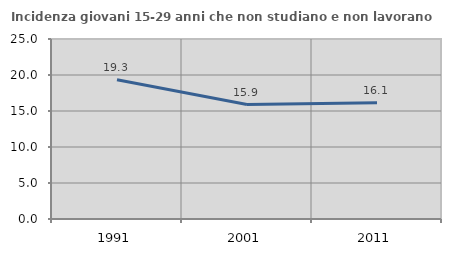
| Category | Incidenza giovani 15-29 anni che non studiano e non lavorano  |
|---|---|
| 1991.0 | 19.344 |
| 2001.0 | 15.893 |
| 2011.0 | 16.129 |